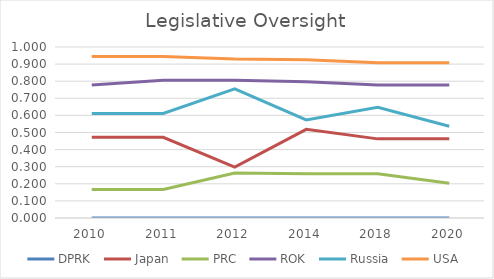
| Category | DPRK  | Japan  | PRC  | ROK  | Russia  | USA  |
|---|---|---|---|---|---|---|
| 2010.0 | 0 | 0.472 | 0.167 | 0.778 | 0.612 | 0.945 |
| 2011.0 | 0 | 0.472 | 0.167 | 0.806 | 0.612 | 0.945 |
| 2012.0 | 0 | 0.298 | 0.263 | 0.806 | 0.755 | 0.93 |
| 2014.0 | 0 | 0.518 | 0.259 | 0.796 | 0.574 | 0.926 |
| 2018.0 | 0 | 0.463 | 0.259 | 0.778 | 0.648 | 0.908 |
| 2020.0 | 0 | 0.463 | 0.203 | 0.778 | 0.537 | 0.908 |